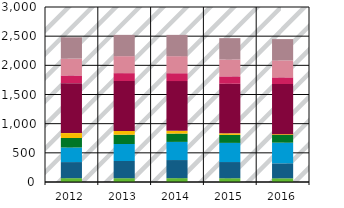
| Category | atmosphärische Deposition auf Gewässerflächen | Erosion | Grundwasser | Oberflächenabfluss | Drainagen | urbane Gebiete (Kanalisationssysteme) | industrielle Direkteinleiter | kommunale Kläranlagen | historischer Bergbau |
|---|---|---|---|---|---|---|---|---|---|
| 2012.0 | 65.601 | 275.868 | 250.109 | 162.739 | 84.336 | 855.363 | 132.677 | 289.323 | 364.905 |
| 2013.0 | 65.067 | 294.952 | 291.501 | 158.928 | 65.659 | 855.155 | 134.862 | 291.297 | 364.905 |
| 2014.0 | 65.85 | 310.424 | 311.319 | 142.04 | 46.808 | 853.676 | 134.623 | 292.528 | 364.905 |
| 2015.0 | 64.447 | 277.741 | 328.183 | 136.521 | 27.419 | 849.804 | 126.785 | 290.017 | 364.905 |
| 2016.0 | 63.322 | 256.672 | 354.124 | 132.502 | 13.876 | 859.831 | 113.418 | 291.212 | 364.905 |